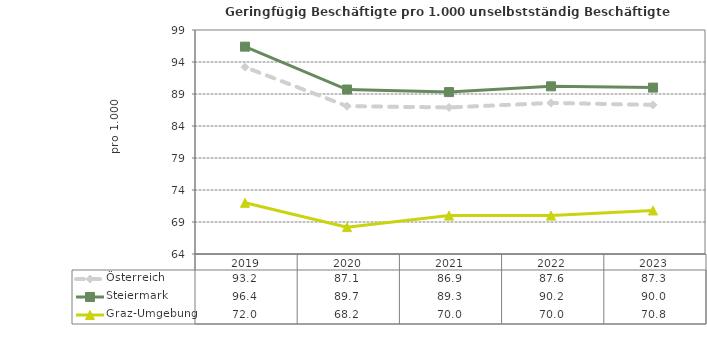
| Category | Österreich | Steiermark | Graz-Umgebung |
|---|---|---|---|
| 2023.0 | 87.3 | 90 | 70.8 |
| 2022.0 | 87.6 | 90.2 | 70 |
| 2021.0 | 86.9 | 89.3 | 70 |
| 2020.0 | 87.1 | 89.7 | 68.2 |
| 2019.0 | 93.2 | 96.4 | 72 |